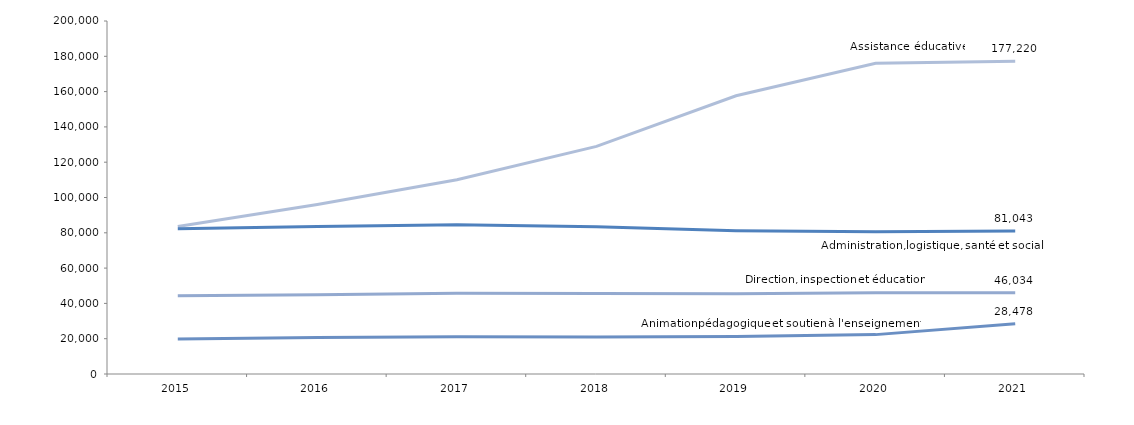
| Category | Animation pédagogique et soutien à l'enseignement | Direction, inspection et éducation | Assistance éducative | Series 7 |
|---|---|---|---|---|
| 2015 | 19792 | 44318 | 83538 | 82352 |
| 2016 | 20637 | 44943 | 95997 | 83556 |
| 2017 | 21091 | 45714 | 110062 | 84501 |
| 2018 | 20968 | 45636 | 128988 | 83376 |
| 2019 | 21270 | 45525 | 157627 | 81204 |
| 2020 | 22310 | 45984 | 176061 | 80614 |
| 2021 | 28478 | 46034 | 177220 | 81043 |